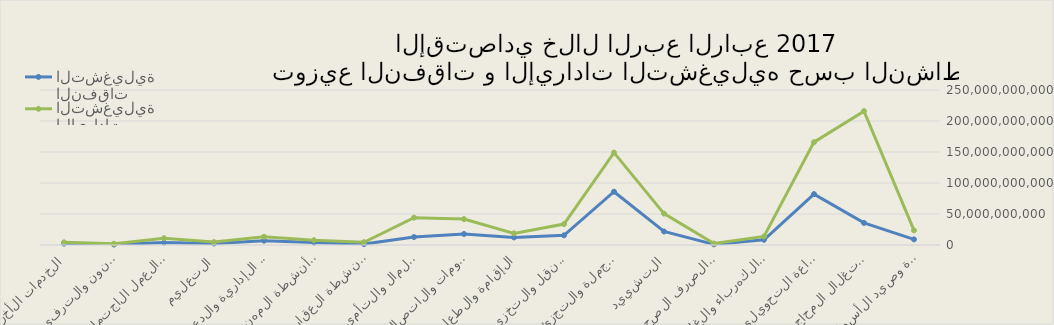
| Category | النفقات التشغيلية | الإيرادات التشغيلية |
|---|---|---|
| الزراعة والحراجة وصيد الأسماك | 9080511234 | 23548871433 |
| التعدين واستغلال المحاجر | 35606743172 | 215876093298 |
| الصناعة التحويلية | 82101223476 | 165908622223 |
| توصيل الكهرباء والغاز  | 8412008399 | 13921667124 |
| امدادات الماء والصرف الصحي | 999072347 | 2388098372 |
| التشييد | 21777068219 | 50600874329 |
| تجارة الجملة والتجزئة | 85961212324 | 148965403456 |
| النقل والتخزين | 15565500128 | 33768769422 |
| الإقامة والطعام | 12153576223 | 18787987318 |
| المعلومات والاتصالات | 17757443478 | 41780112116 |
| أنشطة المال والتأمين | 12809765451 | 44098709147 |
| الأنشطة العقارية | 1442338349 | 4477659326 |
| الأنشطة المهنية  | 3866765214 | 7687533286 |
| الخدمات الإدارية والدعم | 6980007178 | 13298090279 |
| التعليم | 2418871231 | 4708765321 |
| الصحة والعمل الاجتماعي | 3971010484 | 10978095369 |
| الفنون والترفية | 701234411 | 1988760223 |
| الخدمات الأخرى | 2224121342 | 4333656236 |